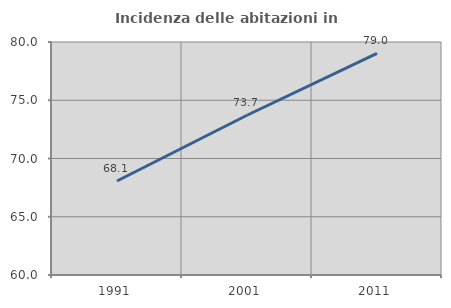
| Category | Incidenza delle abitazioni in proprietà  |
|---|---|
| 1991.0 | 68.066 |
| 2001.0 | 73.711 |
| 2011.0 | 79.015 |